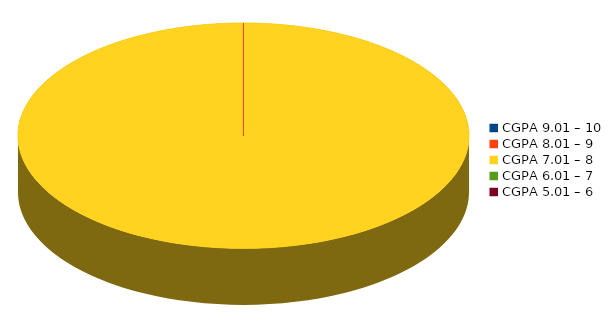
| Category | Number of students |
|---|---|
| CGPA 9.01 – 10 | 0 |
| CGPA 8.01 – 9 | 0 |
| CGPA 7.01 – 8 | 1 |
| CGPA 6.01 – 7 | 0 |
| CGPA 5.01 – 6 | 0 |